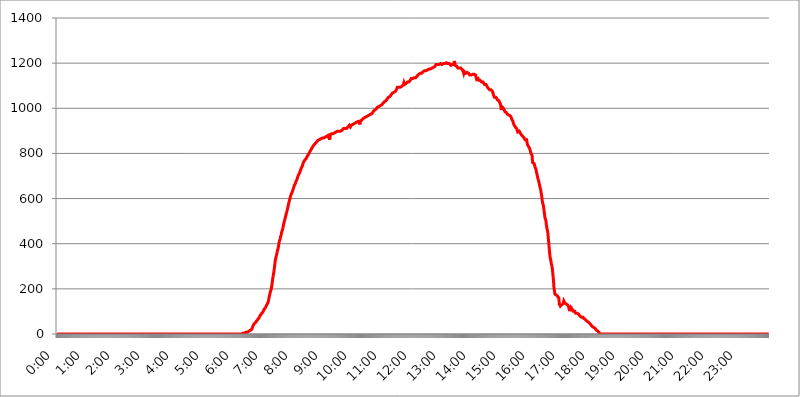
| Category | 2015.09.22. Intenzitás [W/m^2] |
|---|---|
| 0.0 | 0 |
| 0.0006944444444444445 | 0 |
| 0.001388888888888889 | 0 |
| 0.0020833333333333333 | 0 |
| 0.002777777777777778 | 0 |
| 0.003472222222222222 | 0 |
| 0.004166666666666667 | 0 |
| 0.004861111111111111 | 0 |
| 0.005555555555555556 | 0 |
| 0.0062499999999999995 | 0 |
| 0.006944444444444444 | 0 |
| 0.007638888888888889 | 0 |
| 0.008333333333333333 | 0 |
| 0.009027777777777779 | 0 |
| 0.009722222222222222 | 0 |
| 0.010416666666666666 | 0 |
| 0.011111111111111112 | 0 |
| 0.011805555555555555 | 0 |
| 0.012499999999999999 | 0 |
| 0.013194444444444444 | 0 |
| 0.013888888888888888 | 0 |
| 0.014583333333333332 | 0 |
| 0.015277777777777777 | 0 |
| 0.015972222222222224 | 0 |
| 0.016666666666666666 | 0 |
| 0.017361111111111112 | 0 |
| 0.018055555555555557 | 0 |
| 0.01875 | 0 |
| 0.019444444444444445 | 0 |
| 0.02013888888888889 | 0 |
| 0.020833333333333332 | 0 |
| 0.02152777777777778 | 0 |
| 0.022222222222222223 | 0 |
| 0.02291666666666667 | 0 |
| 0.02361111111111111 | 0 |
| 0.024305555555555556 | 0 |
| 0.024999999999999998 | 0 |
| 0.025694444444444447 | 0 |
| 0.02638888888888889 | 0 |
| 0.027083333333333334 | 0 |
| 0.027777777777777776 | 0 |
| 0.02847222222222222 | 0 |
| 0.029166666666666664 | 0 |
| 0.029861111111111113 | 0 |
| 0.030555555555555555 | 0 |
| 0.03125 | 0 |
| 0.03194444444444445 | 0 |
| 0.03263888888888889 | 0 |
| 0.03333333333333333 | 0 |
| 0.034027777777777775 | 0 |
| 0.034722222222222224 | 0 |
| 0.035416666666666666 | 0 |
| 0.036111111111111115 | 0 |
| 0.03680555555555556 | 0 |
| 0.0375 | 0 |
| 0.03819444444444444 | 0 |
| 0.03888888888888889 | 0 |
| 0.03958333333333333 | 0 |
| 0.04027777777777778 | 0 |
| 0.04097222222222222 | 0 |
| 0.041666666666666664 | 0 |
| 0.042361111111111106 | 0 |
| 0.04305555555555556 | 0 |
| 0.043750000000000004 | 0 |
| 0.044444444444444446 | 0 |
| 0.04513888888888889 | 0 |
| 0.04583333333333334 | 0 |
| 0.04652777777777778 | 0 |
| 0.04722222222222222 | 0 |
| 0.04791666666666666 | 0 |
| 0.04861111111111111 | 0 |
| 0.049305555555555554 | 0 |
| 0.049999999999999996 | 0 |
| 0.05069444444444445 | 0 |
| 0.051388888888888894 | 0 |
| 0.052083333333333336 | 0 |
| 0.05277777777777778 | 0 |
| 0.05347222222222222 | 0 |
| 0.05416666666666667 | 0 |
| 0.05486111111111111 | 0 |
| 0.05555555555555555 | 0 |
| 0.05625 | 0 |
| 0.05694444444444444 | 0 |
| 0.057638888888888885 | 0 |
| 0.05833333333333333 | 0 |
| 0.05902777777777778 | 0 |
| 0.059722222222222225 | 0 |
| 0.06041666666666667 | 0 |
| 0.061111111111111116 | 0 |
| 0.06180555555555556 | 0 |
| 0.0625 | 0 |
| 0.06319444444444444 | 0 |
| 0.06388888888888888 | 0 |
| 0.06458333333333334 | 0 |
| 0.06527777777777778 | 0 |
| 0.06597222222222222 | 0 |
| 0.06666666666666667 | 0 |
| 0.06736111111111111 | 0 |
| 0.06805555555555555 | 0 |
| 0.06874999999999999 | 0 |
| 0.06944444444444443 | 0 |
| 0.07013888888888889 | 0 |
| 0.07083333333333333 | 0 |
| 0.07152777777777779 | 0 |
| 0.07222222222222223 | 0 |
| 0.07291666666666667 | 0 |
| 0.07361111111111111 | 0 |
| 0.07430555555555556 | 0 |
| 0.075 | 0 |
| 0.07569444444444444 | 0 |
| 0.0763888888888889 | 0 |
| 0.07708333333333334 | 0 |
| 0.07777777777777778 | 0 |
| 0.07847222222222222 | 0 |
| 0.07916666666666666 | 0 |
| 0.0798611111111111 | 0 |
| 0.08055555555555556 | 0 |
| 0.08125 | 0 |
| 0.08194444444444444 | 0 |
| 0.08263888888888889 | 0 |
| 0.08333333333333333 | 0 |
| 0.08402777777777777 | 0 |
| 0.08472222222222221 | 0 |
| 0.08541666666666665 | 0 |
| 0.08611111111111112 | 0 |
| 0.08680555555555557 | 0 |
| 0.08750000000000001 | 0 |
| 0.08819444444444445 | 0 |
| 0.08888888888888889 | 0 |
| 0.08958333333333333 | 0 |
| 0.09027777777777778 | 0 |
| 0.09097222222222222 | 0 |
| 0.09166666666666667 | 0 |
| 0.09236111111111112 | 0 |
| 0.09305555555555556 | 0 |
| 0.09375 | 0 |
| 0.09444444444444444 | 0 |
| 0.09513888888888888 | 0 |
| 0.09583333333333333 | 0 |
| 0.09652777777777777 | 0 |
| 0.09722222222222222 | 0 |
| 0.09791666666666667 | 0 |
| 0.09861111111111111 | 0 |
| 0.09930555555555555 | 0 |
| 0.09999999999999999 | 0 |
| 0.10069444444444443 | 0 |
| 0.1013888888888889 | 0 |
| 0.10208333333333335 | 0 |
| 0.10277777777777779 | 0 |
| 0.10347222222222223 | 0 |
| 0.10416666666666667 | 0 |
| 0.10486111111111111 | 0 |
| 0.10555555555555556 | 0 |
| 0.10625 | 0 |
| 0.10694444444444444 | 0 |
| 0.1076388888888889 | 0 |
| 0.10833333333333334 | 0 |
| 0.10902777777777778 | 0 |
| 0.10972222222222222 | 0 |
| 0.1111111111111111 | 0 |
| 0.11180555555555556 | 0 |
| 0.11180555555555556 | 0 |
| 0.1125 | 0 |
| 0.11319444444444444 | 0 |
| 0.11388888888888889 | 0 |
| 0.11458333333333333 | 0 |
| 0.11527777777777777 | 0 |
| 0.11597222222222221 | 0 |
| 0.11666666666666665 | 0 |
| 0.1173611111111111 | 0 |
| 0.11805555555555557 | 0 |
| 0.11944444444444445 | 0 |
| 0.12013888888888889 | 0 |
| 0.12083333333333333 | 0 |
| 0.12152777777777778 | 0 |
| 0.12222222222222223 | 0 |
| 0.12291666666666667 | 0 |
| 0.12291666666666667 | 0 |
| 0.12361111111111112 | 0 |
| 0.12430555555555556 | 0 |
| 0.125 | 0 |
| 0.12569444444444444 | 0 |
| 0.12638888888888888 | 0 |
| 0.12708333333333333 | 0 |
| 0.16875 | 0 |
| 0.12847222222222224 | 0 |
| 0.12916666666666668 | 0 |
| 0.12986111111111112 | 0 |
| 0.13055555555555556 | 0 |
| 0.13125 | 0 |
| 0.13194444444444445 | 0 |
| 0.1326388888888889 | 0 |
| 0.13333333333333333 | 0 |
| 0.13402777777777777 | 0 |
| 0.13402777777777777 | 0 |
| 0.13472222222222222 | 0 |
| 0.13541666666666666 | 0 |
| 0.1361111111111111 | 0 |
| 0.13749999999999998 | 0 |
| 0.13819444444444443 | 0 |
| 0.1388888888888889 | 0 |
| 0.13958333333333334 | 0 |
| 0.14027777777777778 | 0 |
| 0.14097222222222222 | 0 |
| 0.14166666666666666 | 0 |
| 0.1423611111111111 | 0 |
| 0.14305555555555557 | 0 |
| 0.14375000000000002 | 0 |
| 0.14444444444444446 | 0 |
| 0.1451388888888889 | 0 |
| 0.1451388888888889 | 0 |
| 0.14652777777777778 | 0 |
| 0.14722222222222223 | 0 |
| 0.14791666666666667 | 0 |
| 0.1486111111111111 | 0 |
| 0.14930555555555555 | 0 |
| 0.15 | 0 |
| 0.15069444444444444 | 0 |
| 0.15138888888888888 | 0 |
| 0.15208333333333332 | 0 |
| 0.15277777777777776 | 0 |
| 0.15347222222222223 | 0 |
| 0.15416666666666667 | 0 |
| 0.15486111111111112 | 0 |
| 0.15555555555555556 | 0 |
| 0.15625 | 0 |
| 0.15694444444444444 | 0 |
| 0.15763888888888888 | 0 |
| 0.15833333333333333 | 0 |
| 0.15902777777777777 | 0 |
| 0.15972222222222224 | 0 |
| 0.16041666666666668 | 0 |
| 0.16111111111111112 | 0 |
| 0.16180555555555556 | 0 |
| 0.1625 | 0 |
| 0.16319444444444445 | 0 |
| 0.1638888888888889 | 0 |
| 0.16458333333333333 | 0 |
| 0.16527777777777777 | 0 |
| 0.16597222222222222 | 0 |
| 0.16666666666666666 | 0 |
| 0.1673611111111111 | 0 |
| 0.16805555555555554 | 0 |
| 0.16874999999999998 | 0 |
| 0.16944444444444443 | 0 |
| 0.17013888888888887 | 0 |
| 0.1708333333333333 | 0 |
| 0.17152777777777775 | 0 |
| 0.17222222222222225 | 0 |
| 0.1729166666666667 | 0 |
| 0.17361111111111113 | 0 |
| 0.17430555555555557 | 0 |
| 0.17500000000000002 | 0 |
| 0.17569444444444446 | 0 |
| 0.1763888888888889 | 0 |
| 0.17708333333333334 | 0 |
| 0.17777777777777778 | 0 |
| 0.17847222222222223 | 0 |
| 0.17916666666666667 | 0 |
| 0.1798611111111111 | 0 |
| 0.18055555555555555 | 0 |
| 0.18125 | 0 |
| 0.18194444444444444 | 0 |
| 0.1826388888888889 | 0 |
| 0.18333333333333335 | 0 |
| 0.1840277777777778 | 0 |
| 0.18472222222222223 | 0 |
| 0.18541666666666667 | 0 |
| 0.18611111111111112 | 0 |
| 0.18680555555555556 | 0 |
| 0.1875 | 0 |
| 0.18819444444444444 | 0 |
| 0.18888888888888888 | 0 |
| 0.18958333333333333 | 0 |
| 0.19027777777777777 | 0 |
| 0.1909722222222222 | 0 |
| 0.19166666666666665 | 0 |
| 0.19236111111111112 | 0 |
| 0.19305555555555554 | 0 |
| 0.19375 | 0 |
| 0.19444444444444445 | 0 |
| 0.1951388888888889 | 0 |
| 0.19583333333333333 | 0 |
| 0.19652777777777777 | 0 |
| 0.19722222222222222 | 0 |
| 0.19791666666666666 | 0 |
| 0.1986111111111111 | 0 |
| 0.19930555555555554 | 0 |
| 0.19999999999999998 | 0 |
| 0.20069444444444443 | 0 |
| 0.20138888888888887 | 0 |
| 0.2020833333333333 | 0 |
| 0.2027777777777778 | 0 |
| 0.2034722222222222 | 0 |
| 0.2041666666666667 | 0 |
| 0.20486111111111113 | 0 |
| 0.20555555555555557 | 0 |
| 0.20625000000000002 | 0 |
| 0.20694444444444446 | 0 |
| 0.2076388888888889 | 0 |
| 0.20833333333333334 | 0 |
| 0.20902777777777778 | 0 |
| 0.20972222222222223 | 0 |
| 0.21041666666666667 | 0 |
| 0.2111111111111111 | 0 |
| 0.21180555555555555 | 0 |
| 0.2125 | 0 |
| 0.21319444444444444 | 0 |
| 0.2138888888888889 | 0 |
| 0.21458333333333335 | 0 |
| 0.2152777777777778 | 0 |
| 0.21597222222222223 | 0 |
| 0.21666666666666667 | 0 |
| 0.21736111111111112 | 0 |
| 0.21805555555555556 | 0 |
| 0.21875 | 0 |
| 0.21944444444444444 | 0 |
| 0.22013888888888888 | 0 |
| 0.22083333333333333 | 0 |
| 0.22152777777777777 | 0 |
| 0.2222222222222222 | 0 |
| 0.22291666666666665 | 0 |
| 0.2236111111111111 | 0 |
| 0.22430555555555556 | 0 |
| 0.225 | 0 |
| 0.22569444444444445 | 0 |
| 0.2263888888888889 | 0 |
| 0.22708333333333333 | 0 |
| 0.22777777777777777 | 0 |
| 0.22847222222222222 | 0 |
| 0.22916666666666666 | 0 |
| 0.2298611111111111 | 0 |
| 0.23055555555555554 | 0 |
| 0.23124999999999998 | 0 |
| 0.23194444444444443 | 0 |
| 0.23263888888888887 | 0 |
| 0.2333333333333333 | 0 |
| 0.2340277777777778 | 0 |
| 0.2347222222222222 | 0 |
| 0.2354166666666667 | 0 |
| 0.23611111111111113 | 0 |
| 0.23680555555555557 | 0 |
| 0.23750000000000002 | 0 |
| 0.23819444444444446 | 0 |
| 0.2388888888888889 | 0 |
| 0.23958333333333334 | 0 |
| 0.24027777777777778 | 0 |
| 0.24097222222222223 | 0 |
| 0.24166666666666667 | 0 |
| 0.2423611111111111 | 0 |
| 0.24305555555555555 | 0 |
| 0.24375 | 0 |
| 0.24444444444444446 | 0 |
| 0.24513888888888888 | 0 |
| 0.24583333333333335 | 0 |
| 0.2465277777777778 | 0 |
| 0.24722222222222223 | 0 |
| 0.24791666666666667 | 0 |
| 0.24861111111111112 | 0 |
| 0.24930555555555556 | 0 |
| 0.25 | 0 |
| 0.25069444444444444 | 0 |
| 0.2513888888888889 | 0 |
| 0.2520833333333333 | 0 |
| 0.25277777777777777 | 0 |
| 0.2534722222222222 | 0 |
| 0.25416666666666665 | 0 |
| 0.2548611111111111 | 0 |
| 0.2555555555555556 | 0 |
| 0.25625000000000003 | 0 |
| 0.2569444444444445 | 0 |
| 0.2576388888888889 | 0 |
| 0.25833333333333336 | 0 |
| 0.2590277777777778 | 3.525 |
| 0.25972222222222224 | 3.525 |
| 0.2604166666666667 | 3.525 |
| 0.2611111111111111 | 3.525 |
| 0.26180555555555557 | 3.525 |
| 0.2625 | 3.525 |
| 0.26319444444444445 | 3.525 |
| 0.2638888888888889 | 3.525 |
| 0.26458333333333334 | 7.887 |
| 0.2652777777777778 | 7.887 |
| 0.2659722222222222 | 7.887 |
| 0.26666666666666666 | 7.887 |
| 0.2673611111111111 | 12.257 |
| 0.26805555555555555 | 12.257 |
| 0.26875 | 12.257 |
| 0.26944444444444443 | 12.257 |
| 0.2701388888888889 | 12.257 |
| 0.2708333333333333 | 16.636 |
| 0.27152777777777776 | 16.636 |
| 0.2722222222222222 | 16.636 |
| 0.27291666666666664 | 21.024 |
| 0.2736111111111111 | 25.419 |
| 0.2743055555555555 | 34.234 |
| 0.27499999999999997 | 38.653 |
| 0.27569444444444446 | 43.079 |
| 0.27638888888888885 | 43.079 |
| 0.27708333333333335 | 47.511 |
| 0.2777777777777778 | 47.511 |
| 0.27847222222222223 | 51.951 |
| 0.2791666666666667 | 56.398 |
| 0.2798611111111111 | 56.398 |
| 0.28055555555555556 | 60.85 |
| 0.28125 | 65.31 |
| 0.28194444444444444 | 65.31 |
| 0.2826388888888889 | 69.775 |
| 0.2833333333333333 | 74.246 |
| 0.28402777777777777 | 78.722 |
| 0.2847222222222222 | 83.205 |
| 0.28541666666666665 | 83.205 |
| 0.28611111111111115 | 87.692 |
| 0.28680555555555554 | 92.184 |
| 0.28750000000000003 | 92.184 |
| 0.2881944444444445 | 96.682 |
| 0.2888888888888889 | 101.184 |
| 0.28958333333333336 | 105.69 |
| 0.2902777777777778 | 110.201 |
| 0.29097222222222224 | 110.201 |
| 0.2916666666666667 | 114.716 |
| 0.2923611111111111 | 119.235 |
| 0.29305555555555557 | 123.758 |
| 0.29375 | 128.284 |
| 0.29444444444444445 | 132.814 |
| 0.2951388888888889 | 137.347 |
| 0.29583333333333334 | 141.884 |
| 0.2965277777777778 | 150.964 |
| 0.2972222222222222 | 164.605 |
| 0.29791666666666666 | 173.709 |
| 0.2986111111111111 | 182.82 |
| 0.29930555555555555 | 191.937 |
| 0.3 | 196.497 |
| 0.30069444444444443 | 210.182 |
| 0.3013888888888889 | 223.873 |
| 0.3020833333333333 | 242.127 |
| 0.30277777777777776 | 255.813 |
| 0.3034722222222222 | 269.49 |
| 0.30416666666666664 | 283.156 |
| 0.3048611111111111 | 301.354 |
| 0.3055555555555555 | 319.517 |
| 0.30624999999999997 | 333.113 |
| 0.3069444444444444 | 342.162 |
| 0.3076388888888889 | 351.198 |
| 0.30833333333333335 | 360.221 |
| 0.3090277777777778 | 373.729 |
| 0.30972222222222223 | 378.224 |
| 0.3104166666666667 | 391.685 |
| 0.3111111111111111 | 405.108 |
| 0.31180555555555556 | 414.035 |
| 0.3125 | 418.492 |
| 0.31319444444444444 | 431.833 |
| 0.3138888888888889 | 436.27 |
| 0.3145833333333333 | 449.551 |
| 0.31527777777777777 | 453.968 |
| 0.3159722222222222 | 462.786 |
| 0.31666666666666665 | 471.582 |
| 0.31736111111111115 | 484.735 |
| 0.31805555555555554 | 493.475 |
| 0.31875000000000003 | 502.192 |
| 0.3194444444444445 | 510.885 |
| 0.3201388888888889 | 519.555 |
| 0.32083333333333336 | 528.2 |
| 0.3215277777777778 | 536.82 |
| 0.32222222222222224 | 545.416 |
| 0.3229166666666667 | 553.986 |
| 0.3236111111111111 | 562.53 |
| 0.32430555555555557 | 575.299 |
| 0.325 | 583.779 |
| 0.32569444444444445 | 592.233 |
| 0.3263888888888889 | 600.661 |
| 0.32708333333333334 | 609.062 |
| 0.3277777777777778 | 617.436 |
| 0.3284722222222222 | 621.613 |
| 0.32916666666666666 | 625.784 |
| 0.3298611111111111 | 629.948 |
| 0.33055555555555555 | 638.256 |
| 0.33125 | 646.537 |
| 0.33194444444444443 | 650.667 |
| 0.3326388888888889 | 658.909 |
| 0.3333333333333333 | 663.019 |
| 0.3340277777777778 | 667.123 |
| 0.3347222222222222 | 675.311 |
| 0.3354166666666667 | 679.395 |
| 0.3361111111111111 | 683.473 |
| 0.3368055555555556 | 691.608 |
| 0.33749999999999997 | 695.666 |
| 0.33819444444444446 | 703.762 |
| 0.33888888888888885 | 707.8 |
| 0.33958333333333335 | 711.832 |
| 0.34027777777777773 | 715.858 |
| 0.34097222222222223 | 723.889 |
| 0.3416666666666666 | 727.896 |
| 0.3423611111111111 | 735.89 |
| 0.3430555555555555 | 739.877 |
| 0.34375 | 743.859 |
| 0.3444444444444445 | 751.803 |
| 0.3451388888888889 | 759.723 |
| 0.3458333333333334 | 759.723 |
| 0.34652777777777777 | 767.62 |
| 0.34722222222222227 | 771.559 |
| 0.34791666666666665 | 771.559 |
| 0.34861111111111115 | 775.492 |
| 0.34930555555555554 | 779.42 |
| 0.35000000000000003 | 783.342 |
| 0.3506944444444444 | 787.258 |
| 0.3513888888888889 | 791.169 |
| 0.3520833333333333 | 795.074 |
| 0.3527777777777778 | 798.974 |
| 0.3534722222222222 | 802.868 |
| 0.3541666666666667 | 806.757 |
| 0.3548611111111111 | 806.757 |
| 0.35555555555555557 | 802.868 |
| 0.35625 | 818.392 |
| 0.35694444444444445 | 822.26 |
| 0.3576388888888889 | 826.123 |
| 0.35833333333333334 | 829.981 |
| 0.3590277777777778 | 833.834 |
| 0.3597222222222222 | 833.834 |
| 0.36041666666666666 | 837.682 |
| 0.3611111111111111 | 841.526 |
| 0.36180555555555555 | 845.365 |
| 0.3625 | 845.365 |
| 0.36319444444444443 | 849.199 |
| 0.3638888888888889 | 849.199 |
| 0.3645833333333333 | 853.029 |
| 0.3652777777777778 | 856.855 |
| 0.3659722222222222 | 856.855 |
| 0.3666666666666667 | 853.029 |
| 0.3673611111111111 | 860.676 |
| 0.3680555555555556 | 864.493 |
| 0.36874999999999997 | 864.493 |
| 0.36944444444444446 | 864.493 |
| 0.37013888888888885 | 868.305 |
| 0.37083333333333335 | 868.305 |
| 0.37152777777777773 | 868.305 |
| 0.37222222222222223 | 868.305 |
| 0.3729166666666666 | 868.305 |
| 0.3736111111111111 | 868.305 |
| 0.3743055555555555 | 868.305 |
| 0.375 | 868.305 |
| 0.3756944444444445 | 872.114 |
| 0.3763888888888889 | 875.918 |
| 0.3770833333333334 | 872.114 |
| 0.37777777777777777 | 875.918 |
| 0.37847222222222227 | 875.918 |
| 0.37916666666666665 | 875.918 |
| 0.37986111111111115 | 879.719 |
| 0.38055555555555554 | 883.516 |
| 0.38125000000000003 | 883.516 |
| 0.3819444444444444 | 860.676 |
| 0.3826388888888889 | 883.516 |
| 0.3833333333333333 | 887.309 |
| 0.3840277777777778 | 887.309 |
| 0.3847222222222222 | 887.309 |
| 0.3854166666666667 | 887.309 |
| 0.3861111111111111 | 887.309 |
| 0.38680555555555557 | 887.309 |
| 0.3875 | 891.099 |
| 0.38819444444444445 | 891.099 |
| 0.3888888888888889 | 891.099 |
| 0.38958333333333334 | 894.885 |
| 0.3902777777777778 | 894.885 |
| 0.3909722222222222 | 894.885 |
| 0.39166666666666666 | 898.668 |
| 0.3923611111111111 | 898.668 |
| 0.39305555555555555 | 898.668 |
| 0.39375 | 898.668 |
| 0.39444444444444443 | 902.447 |
| 0.3951388888888889 | 898.668 |
| 0.3958333333333333 | 898.668 |
| 0.3965277777777778 | 898.668 |
| 0.3972222222222222 | 898.668 |
| 0.3979166666666667 | 902.447 |
| 0.3986111111111111 | 898.668 |
| 0.3993055555555556 | 902.447 |
| 0.39999999999999997 | 902.447 |
| 0.40069444444444446 | 906.223 |
| 0.40138888888888885 | 909.996 |
| 0.40208333333333335 | 909.996 |
| 0.40277777777777773 | 909.996 |
| 0.40347222222222223 | 909.996 |
| 0.4041666666666666 | 913.766 |
| 0.4048611111111111 | 913.766 |
| 0.4055555555555555 | 909.996 |
| 0.40625 | 913.766 |
| 0.4069444444444445 | 913.766 |
| 0.4076388888888889 | 917.534 |
| 0.4083333333333334 | 921.298 |
| 0.40902777777777777 | 921.298 |
| 0.40972222222222227 | 925.06 |
| 0.41041666666666665 | 925.06 |
| 0.41111111111111115 | 917.534 |
| 0.41180555555555554 | 917.534 |
| 0.41250000000000003 | 925.06 |
| 0.4131944444444444 | 925.06 |
| 0.4138888888888889 | 928.819 |
| 0.4145833333333333 | 928.819 |
| 0.4152777777777778 | 928.819 |
| 0.4159722222222222 | 932.576 |
| 0.4166666666666667 | 932.576 |
| 0.4173611111111111 | 932.576 |
| 0.41805555555555557 | 932.576 |
| 0.41875 | 936.33 |
| 0.41944444444444445 | 936.33 |
| 0.4201388888888889 | 936.33 |
| 0.42083333333333334 | 940.082 |
| 0.4215277777777778 | 940.082 |
| 0.4222222222222222 | 940.082 |
| 0.42291666666666666 | 940.082 |
| 0.4236111111111111 | 947.58 |
| 0.42430555555555555 | 928.819 |
| 0.425 | 943.832 |
| 0.42569444444444443 | 947.58 |
| 0.4263888888888889 | 947.58 |
| 0.4270833333333333 | 947.58 |
| 0.4277777777777778 | 951.327 |
| 0.4284722222222222 | 951.327 |
| 0.4291666666666667 | 955.071 |
| 0.4298611111111111 | 955.071 |
| 0.4305555555555556 | 958.814 |
| 0.43124999999999997 | 958.814 |
| 0.43194444444444446 | 955.071 |
| 0.43263888888888885 | 958.814 |
| 0.43333333333333335 | 962.555 |
| 0.43402777777777773 | 962.555 |
| 0.43472222222222223 | 962.555 |
| 0.4354166666666666 | 966.295 |
| 0.4361111111111111 | 966.295 |
| 0.4368055555555555 | 970.034 |
| 0.4375 | 970.034 |
| 0.4381944444444445 | 973.772 |
| 0.4388888888888889 | 973.772 |
| 0.4395833333333334 | 973.772 |
| 0.44027777777777777 | 977.508 |
| 0.44097222222222227 | 977.508 |
| 0.44166666666666665 | 977.508 |
| 0.44236111111111115 | 981.244 |
| 0.44305555555555554 | 984.98 |
| 0.44375000000000003 | 988.714 |
| 0.4444444444444444 | 988.714 |
| 0.4451388888888889 | 992.448 |
| 0.4458333333333333 | 992.448 |
| 0.4465277777777778 | 996.182 |
| 0.4472222222222222 | 996.182 |
| 0.4479166666666667 | 999.916 |
| 0.4486111111111111 | 1003.65 |
| 0.44930555555555557 | 999.916 |
| 0.45 | 1007.383 |
| 0.45069444444444445 | 1007.383 |
| 0.4513888888888889 | 1007.383 |
| 0.45208333333333334 | 1011.118 |
| 0.4527777777777778 | 1011.118 |
| 0.4534722222222222 | 1007.383 |
| 0.45416666666666666 | 1011.118 |
| 0.4548611111111111 | 1014.852 |
| 0.45555555555555555 | 1014.852 |
| 0.45625 | 1018.587 |
| 0.45694444444444443 | 1022.323 |
| 0.4576388888888889 | 1026.06 |
| 0.4583333333333333 | 1026.06 |
| 0.4590277777777778 | 1029.798 |
| 0.4597222222222222 | 1029.798 |
| 0.4604166666666667 | 1033.537 |
| 0.4611111111111111 | 1033.537 |
| 0.4618055555555556 | 1037.277 |
| 0.46249999999999997 | 1041.019 |
| 0.46319444444444446 | 1041.019 |
| 0.46388888888888885 | 1044.762 |
| 0.46458333333333335 | 1048.508 |
| 0.46527777777777773 | 1048.508 |
| 0.46597222222222223 | 1052.255 |
| 0.4666666666666666 | 1052.255 |
| 0.4673611111111111 | 1056.004 |
| 0.4680555555555555 | 1059.756 |
| 0.46875 | 1059.756 |
| 0.4694444444444445 | 1063.51 |
| 0.4701388888888889 | 1067.267 |
| 0.4708333333333334 | 1067.267 |
| 0.47152777777777777 | 1067.267 |
| 0.47222222222222227 | 1071.027 |
| 0.47291666666666665 | 1071.027 |
| 0.47361111111111115 | 1074.789 |
| 0.47430555555555554 | 1074.789 |
| 0.47500000000000003 | 1074.789 |
| 0.4756944444444444 | 1082.324 |
| 0.4763888888888889 | 1086.097 |
| 0.4770833333333333 | 1093.653 |
| 0.4777777777777778 | 1093.653 |
| 0.4784722222222222 | 1093.653 |
| 0.4791666666666667 | 1093.653 |
| 0.4798611111111111 | 1093.653 |
| 0.48055555555555557 | 1093.653 |
| 0.48125 | 1093.653 |
| 0.48194444444444445 | 1093.653 |
| 0.4826388888888889 | 1093.653 |
| 0.48333333333333334 | 1097.437 |
| 0.4840277777777778 | 1097.437 |
| 0.4847222222222222 | 1101.226 |
| 0.48541666666666666 | 1105.019 |
| 0.4861111111111111 | 1112.618 |
| 0.48680555555555555 | 1105.019 |
| 0.4875 | 1108.816 |
| 0.48819444444444443 | 1105.019 |
| 0.4888888888888889 | 1108.816 |
| 0.4895833333333333 | 1108.816 |
| 0.4902777777777778 | 1112.618 |
| 0.4909722222222222 | 1116.426 |
| 0.4916666666666667 | 1116.426 |
| 0.4923611111111111 | 1116.426 |
| 0.4930555555555556 | 1116.426 |
| 0.49374999999999997 | 1120.238 |
| 0.49444444444444446 | 1120.238 |
| 0.49513888888888885 | 1124.056 |
| 0.49583333333333335 | 1127.879 |
| 0.49652777777777773 | 1131.708 |
| 0.49722222222222223 | 1131.708 |
| 0.4979166666666666 | 1131.708 |
| 0.4986111111111111 | 1131.708 |
| 0.4993055555555555 | 1135.543 |
| 0.5 | 1135.543 |
| 0.5006944444444444 | 1135.543 |
| 0.5013888888888889 | 1139.384 |
| 0.5020833333333333 | 1139.384 |
| 0.5027777777777778 | 1135.543 |
| 0.5034722222222222 | 1139.384 |
| 0.5041666666666667 | 1139.384 |
| 0.5048611111111111 | 1143.232 |
| 0.5055555555555555 | 1147.086 |
| 0.50625 | 1147.086 |
| 0.5069444444444444 | 1150.946 |
| 0.5076388888888889 | 1150.946 |
| 0.5083333333333333 | 1154.814 |
| 0.5090277777777777 | 1154.814 |
| 0.5097222222222222 | 1154.814 |
| 0.5104166666666666 | 1154.814 |
| 0.5111111111111112 | 1154.814 |
| 0.5118055555555555 | 1158.689 |
| 0.5125000000000001 | 1158.689 |
| 0.5131944444444444 | 1162.571 |
| 0.513888888888889 | 1162.571 |
| 0.5145833333333333 | 1162.571 |
| 0.5152777777777778 | 1166.46 |
| 0.5159722222222222 | 1162.571 |
| 0.5166666666666667 | 1162.571 |
| 0.517361111111111 | 1166.46 |
| 0.5180555555555556 | 1166.46 |
| 0.5187499999999999 | 1162.571 |
| 0.5194444444444445 | 1170.358 |
| 0.5201388888888888 | 1170.358 |
| 0.5208333333333334 | 1174.263 |
| 0.5215277777777778 | 1174.263 |
| 0.5222222222222223 | 1170.358 |
| 0.5229166666666667 | 1170.358 |
| 0.5236111111111111 | 1174.263 |
| 0.5243055555555556 | 1178.177 |
| 0.525 | 1178.177 |
| 0.5256944444444445 | 1178.177 |
| 0.5263888888888889 | 1174.263 |
| 0.5270833333333333 | 1178.177 |
| 0.5277777777777778 | 1182.099 |
| 0.5284722222222222 | 1182.099 |
| 0.5291666666666667 | 1186.03 |
| 0.5298611111111111 | 1186.03 |
| 0.5305555555555556 | 1189.969 |
| 0.53125 | 1193.918 |
| 0.5319444444444444 | 1193.918 |
| 0.5326388888888889 | 1189.969 |
| 0.5333333333333333 | 1193.918 |
| 0.5340277777777778 | 1193.918 |
| 0.5347222222222222 | 1193.918 |
| 0.5354166666666667 | 1193.918 |
| 0.5361111111111111 | 1193.918 |
| 0.5368055555555555 | 1193.918 |
| 0.5375 | 1197.876 |
| 0.5381944444444444 | 1193.918 |
| 0.5388888888888889 | 1197.876 |
| 0.5395833333333333 | 1193.918 |
| 0.5402777777777777 | 1193.918 |
| 0.5409722222222222 | 1197.876 |
| 0.5416666666666666 | 1197.876 |
| 0.5423611111111112 | 1197.876 |
| 0.5430555555555555 | 1193.918 |
| 0.5437500000000001 | 1197.876 |
| 0.5444444444444444 | 1197.876 |
| 0.545138888888889 | 1197.876 |
| 0.5458333333333333 | 1201.843 |
| 0.5465277777777778 | 1197.876 |
| 0.5472222222222222 | 1197.876 |
| 0.5479166666666667 | 1197.876 |
| 0.548611111111111 | 1197.876 |
| 0.5493055555555556 | 1197.876 |
| 0.5499999999999999 | 1197.876 |
| 0.5506944444444445 | 1197.876 |
| 0.5513888888888888 | 1193.918 |
| 0.5520833333333334 | 1189.969 |
| 0.5527777777777778 | 1193.918 |
| 0.5534722222222223 | 1193.918 |
| 0.5541666666666667 | 1193.918 |
| 0.5548611111111111 | 1193.918 |
| 0.5555555555555556 | 1189.969 |
| 0.55625 | 1193.918 |
| 0.5569444444444445 | 1209.807 |
| 0.5576388888888889 | 1197.876 |
| 0.5583333333333333 | 1189.969 |
| 0.5590277777777778 | 1189.969 |
| 0.5597222222222222 | 1186.03 |
| 0.5604166666666667 | 1186.03 |
| 0.5611111111111111 | 1186.03 |
| 0.5618055555555556 | 1178.177 |
| 0.5625 | 1182.099 |
| 0.5631944444444444 | 1178.177 |
| 0.5638888888888889 | 1178.177 |
| 0.5645833333333333 | 1174.263 |
| 0.5652777777777778 | 1178.177 |
| 0.5659722222222222 | 1178.177 |
| 0.5666666666666667 | 1174.263 |
| 0.5673611111111111 | 1174.263 |
| 0.5680555555555555 | 1170.358 |
| 0.56875 | 1170.358 |
| 0.5694444444444444 | 1162.571 |
| 0.5701388888888889 | 1154.814 |
| 0.5708333333333333 | 1162.571 |
| 0.5715277777777777 | 1162.571 |
| 0.5722222222222222 | 1162.571 |
| 0.5729166666666666 | 1154.814 |
| 0.5736111111111112 | 1154.814 |
| 0.5743055555555555 | 1158.689 |
| 0.5750000000000001 | 1158.689 |
| 0.5756944444444444 | 1162.571 |
| 0.576388888888889 | 1158.689 |
| 0.5770833333333333 | 1154.814 |
| 0.5777777777777778 | 1150.946 |
| 0.5784722222222222 | 1147.086 |
| 0.5791666666666667 | 1147.086 |
| 0.579861111111111 | 1147.086 |
| 0.5805555555555556 | 1147.086 |
| 0.5812499999999999 | 1150.946 |
| 0.5819444444444445 | 1150.946 |
| 0.5826388888888888 | 1150.946 |
| 0.5833333333333334 | 1150.946 |
| 0.5840277777777778 | 1150.946 |
| 0.5847222222222223 | 1150.946 |
| 0.5854166666666667 | 1150.946 |
| 0.5861111111111111 | 1150.946 |
| 0.5868055555555556 | 1147.086 |
| 0.5875 | 1135.543 |
| 0.5881944444444445 | 1127.879 |
| 0.5888888888888889 | 1131.708 |
| 0.5895833333333333 | 1131.708 |
| 0.5902777777777778 | 1131.708 |
| 0.5909722222222222 | 1124.056 |
| 0.5916666666666667 | 1127.879 |
| 0.5923611111111111 | 1127.879 |
| 0.5930555555555556 | 1124.056 |
| 0.59375 | 1120.238 |
| 0.5944444444444444 | 1120.238 |
| 0.5951388888888889 | 1116.426 |
| 0.5958333333333333 | 1116.426 |
| 0.5965277777777778 | 1116.426 |
| 0.5972222222222222 | 1116.426 |
| 0.5979166666666667 | 1116.426 |
| 0.5986111111111111 | 1112.618 |
| 0.5993055555555555 | 1105.019 |
| 0.6 | 1105.019 |
| 0.6006944444444444 | 1105.019 |
| 0.6013888888888889 | 1105.019 |
| 0.6020833333333333 | 1101.226 |
| 0.6027777777777777 | 1097.437 |
| 0.6034722222222222 | 1093.653 |
| 0.6041666666666666 | 1089.873 |
| 0.6048611111111112 | 1093.653 |
| 0.6055555555555555 | 1086.097 |
| 0.6062500000000001 | 1082.324 |
| 0.6069444444444444 | 1082.324 |
| 0.607638888888889 | 1082.324 |
| 0.6083333333333333 | 1082.324 |
| 0.6090277777777778 | 1078.555 |
| 0.6097222222222222 | 1078.555 |
| 0.6104166666666667 | 1074.789 |
| 0.611111111111111 | 1074.789 |
| 0.6118055555555556 | 1059.756 |
| 0.6124999999999999 | 1056.004 |
| 0.6131944444444445 | 1048.508 |
| 0.6138888888888888 | 1048.508 |
| 0.6145833333333334 | 1044.762 |
| 0.6152777777777778 | 1048.508 |
| 0.6159722222222223 | 1044.762 |
| 0.6166666666666667 | 1044.762 |
| 0.6173611111111111 | 1037.277 |
| 0.6180555555555556 | 1041.019 |
| 0.61875 | 1041.019 |
| 0.6194444444444445 | 1033.537 |
| 0.6201388888888889 | 1029.798 |
| 0.6208333333333333 | 1029.798 |
| 0.6215277777777778 | 1018.587 |
| 0.6222222222222222 | 1007.383 |
| 0.6229166666666667 | 992.448 |
| 0.6236111111111111 | 1007.383 |
| 0.6243055555555556 | 1007.383 |
| 0.625 | 1003.65 |
| 0.6256944444444444 | 999.916 |
| 0.6263888888888889 | 996.182 |
| 0.6270833333333333 | 992.448 |
| 0.6277777777777778 | 984.98 |
| 0.6284722222222222 | 984.98 |
| 0.6291666666666667 | 981.244 |
| 0.6298611111111111 | 981.244 |
| 0.6305555555555555 | 977.508 |
| 0.63125 | 973.772 |
| 0.6319444444444444 | 973.772 |
| 0.6326388888888889 | 970.034 |
| 0.6333333333333333 | 970.034 |
| 0.6340277777777777 | 970.034 |
| 0.6347222222222222 | 970.034 |
| 0.6354166666666666 | 966.295 |
| 0.6361111111111112 | 966.295 |
| 0.6368055555555555 | 958.814 |
| 0.6375000000000001 | 951.327 |
| 0.6381944444444444 | 947.58 |
| 0.638888888888889 | 943.832 |
| 0.6395833333333333 | 936.33 |
| 0.6402777777777778 | 928.819 |
| 0.6409722222222222 | 928.819 |
| 0.6416666666666667 | 925.06 |
| 0.642361111111111 | 917.534 |
| 0.6430555555555556 | 913.766 |
| 0.6437499999999999 | 913.766 |
| 0.6444444444444445 | 909.996 |
| 0.6451388888888888 | 906.223 |
| 0.6458333333333334 | 894.885 |
| 0.6465277777777778 | 894.885 |
| 0.6472222222222223 | 891.099 |
| 0.6479166666666667 | 898.668 |
| 0.6486111111111111 | 894.885 |
| 0.6493055555555556 | 891.099 |
| 0.65 | 887.309 |
| 0.6506944444444445 | 883.516 |
| 0.6513888888888889 | 887.309 |
| 0.6520833333333333 | 883.516 |
| 0.6527777777777778 | 875.918 |
| 0.6534722222222222 | 875.918 |
| 0.6541666666666667 | 872.114 |
| 0.6548611111111111 | 868.305 |
| 0.6555555555555556 | 864.493 |
| 0.65625 | 860.676 |
| 0.6569444444444444 | 860.676 |
| 0.6576388888888889 | 856.855 |
| 0.6583333333333333 | 860.676 |
| 0.6590277777777778 | 845.365 |
| 0.6597222222222222 | 837.682 |
| 0.6604166666666667 | 837.682 |
| 0.6611111111111111 | 829.981 |
| 0.6618055555555555 | 826.123 |
| 0.6625 | 822.26 |
| 0.6631944444444444 | 814.519 |
| 0.6638888888888889 | 810.641 |
| 0.6645833333333333 | 798.974 |
| 0.6652777777777777 | 795.074 |
| 0.6659722222222222 | 791.169 |
| 0.6666666666666666 | 759.723 |
| 0.6673611111111111 | 759.723 |
| 0.6680555555555556 | 759.723 |
| 0.6687500000000001 | 755.766 |
| 0.6694444444444444 | 747.834 |
| 0.6701388888888888 | 739.877 |
| 0.6708333333333334 | 735.89 |
| 0.6715277777777778 | 727.896 |
| 0.6722222222222222 | 715.858 |
| 0.6729166666666666 | 707.8 |
| 0.6736111111111112 | 695.666 |
| 0.6743055555555556 | 687.544 |
| 0.6749999999999999 | 683.473 |
| 0.6756944444444444 | 671.22 |
| 0.6763888888888889 | 667.123 |
| 0.6770833333333334 | 650.667 |
| 0.6777777777777777 | 642.4 |
| 0.6784722222222223 | 629.948 |
| 0.6791666666666667 | 617.436 |
| 0.6798611111111111 | 600.661 |
| 0.6805555555555555 | 583.779 |
| 0.68125 | 575.299 |
| 0.6819444444444445 | 566.793 |
| 0.6826388888888889 | 549.704 |
| 0.6833333333333332 | 532.513 |
| 0.6840277777777778 | 515.223 |
| 0.6847222222222222 | 510.885 |
| 0.6854166666666667 | 502.192 |
| 0.686111111111111 | 480.356 |
| 0.6868055555555556 | 467.187 |
| 0.6875 | 458.38 |
| 0.6881944444444444 | 445.129 |
| 0.688888888888889 | 418.492 |
| 0.6895833333333333 | 396.164 |
| 0.6902777777777778 | 369.23 |
| 0.6909722222222222 | 346.682 |
| 0.6916666666666668 | 333.113 |
| 0.6923611111111111 | 324.052 |
| 0.6930555555555555 | 310.44 |
| 0.69375 | 301.354 |
| 0.6944444444444445 | 287.709 |
| 0.6951388888888889 | 264.932 |
| 0.6958333333333333 | 242.127 |
| 0.6965277777777777 | 210.182 |
| 0.6972222222222223 | 191.937 |
| 0.6979166666666666 | 178.264 |
| 0.6986111111111111 | 178.264 |
| 0.6993055555555556 | 173.709 |
| 0.7000000000000001 | 173.709 |
| 0.7006944444444444 | 173.709 |
| 0.7013888888888888 | 169.156 |
| 0.7020833333333334 | 164.605 |
| 0.7027777777777778 | 164.605 |
| 0.7034722222222222 | 160.056 |
| 0.7041666666666666 | 132.814 |
| 0.7048611111111112 | 132.814 |
| 0.7055555555555556 | 123.758 |
| 0.7062499999999999 | 123.758 |
| 0.7069444444444444 | 128.284 |
| 0.7076388888888889 | 128.284 |
| 0.7083333333333334 | 128.284 |
| 0.7090277777777777 | 132.814 |
| 0.7097222222222223 | 137.347 |
| 0.7104166666666667 | 146.423 |
| 0.7111111111111111 | 141.884 |
| 0.7118055555555555 | 137.347 |
| 0.7125 | 137.347 |
| 0.7131944444444445 | 137.347 |
| 0.7138888888888889 | 132.814 |
| 0.7145833333333332 | 132.814 |
| 0.7152777777777778 | 132.814 |
| 0.7159722222222222 | 128.284 |
| 0.7166666666666667 | 128.284 |
| 0.717361111111111 | 119.235 |
| 0.7180555555555556 | 119.235 |
| 0.71875 | 101.184 |
| 0.7194444444444444 | 114.716 |
| 0.720138888888889 | 119.235 |
| 0.7208333333333333 | 119.235 |
| 0.7215277777777778 | 119.235 |
| 0.7222222222222222 | 110.201 |
| 0.7229166666666668 | 105.69 |
| 0.7236111111111111 | 101.184 |
| 0.7243055555555555 | 101.184 |
| 0.725 | 101.184 |
| 0.7256944444444445 | 101.184 |
| 0.7263888888888889 | 101.184 |
| 0.7270833333333333 | 92.184 |
| 0.7277777777777777 | 92.184 |
| 0.7284722222222223 | 92.184 |
| 0.7291666666666666 | 92.184 |
| 0.7298611111111111 | 92.184 |
| 0.7305555555555556 | 92.184 |
| 0.7312500000000001 | 87.692 |
| 0.7319444444444444 | 83.205 |
| 0.7326388888888888 | 83.205 |
| 0.7333333333333334 | 78.722 |
| 0.7340277777777778 | 78.722 |
| 0.7347222222222222 | 78.722 |
| 0.7354166666666666 | 74.246 |
| 0.7361111111111112 | 74.246 |
| 0.7368055555555556 | 74.246 |
| 0.7374999999999999 | 74.246 |
| 0.7381944444444444 | 69.775 |
| 0.7388888888888889 | 69.775 |
| 0.7395833333333334 | 69.775 |
| 0.7402777777777777 | 65.31 |
| 0.7409722222222223 | 65.31 |
| 0.7416666666666667 | 60.85 |
| 0.7423611111111111 | 60.85 |
| 0.7430555555555555 | 56.398 |
| 0.74375 | 56.398 |
| 0.7444444444444445 | 56.398 |
| 0.7451388888888889 | 51.951 |
| 0.7458333333333332 | 51.951 |
| 0.7465277777777778 | 47.511 |
| 0.7472222222222222 | 47.511 |
| 0.7479166666666667 | 43.079 |
| 0.748611111111111 | 43.079 |
| 0.7493055555555556 | 38.653 |
| 0.75 | 34.234 |
| 0.7506944444444444 | 29.823 |
| 0.751388888888889 | 29.823 |
| 0.7520833333333333 | 29.823 |
| 0.7527777777777778 | 25.419 |
| 0.7534722222222222 | 25.419 |
| 0.7541666666666668 | 25.419 |
| 0.7548611111111111 | 21.024 |
| 0.7555555555555555 | 21.024 |
| 0.75625 | 16.636 |
| 0.7569444444444445 | 16.636 |
| 0.7576388888888889 | 12.257 |
| 0.7583333333333333 | 12.257 |
| 0.7590277777777777 | 7.887 |
| 0.7597222222222223 | 7.887 |
| 0.7604166666666666 | 3.525 |
| 0.7611111111111111 | 3.525 |
| 0.7618055555555556 | 3.525 |
| 0.7625000000000001 | 0 |
| 0.7631944444444444 | 0 |
| 0.7638888888888888 | 0 |
| 0.7645833333333334 | 0 |
| 0.7652777777777778 | 0 |
| 0.7659722222222222 | 0 |
| 0.7666666666666666 | 0 |
| 0.7673611111111112 | 0 |
| 0.7680555555555556 | 0 |
| 0.7687499999999999 | 0 |
| 0.7694444444444444 | 0 |
| 0.7701388888888889 | 0 |
| 0.7708333333333334 | 0 |
| 0.7715277777777777 | 0 |
| 0.7722222222222223 | 0 |
| 0.7729166666666667 | 0 |
| 0.7736111111111111 | 0 |
| 0.7743055555555555 | 0 |
| 0.775 | 0 |
| 0.7756944444444445 | 0 |
| 0.7763888888888889 | 0 |
| 0.7770833333333332 | 0 |
| 0.7777777777777778 | 0 |
| 0.7784722222222222 | 0 |
| 0.7791666666666667 | 0 |
| 0.779861111111111 | 0 |
| 0.7805555555555556 | 0 |
| 0.78125 | 0 |
| 0.7819444444444444 | 0 |
| 0.782638888888889 | 0 |
| 0.7833333333333333 | 0 |
| 0.7840277777777778 | 0 |
| 0.7847222222222222 | 0 |
| 0.7854166666666668 | 0 |
| 0.7861111111111111 | 0 |
| 0.7868055555555555 | 0 |
| 0.7875 | 0 |
| 0.7881944444444445 | 0 |
| 0.7888888888888889 | 0 |
| 0.7895833333333333 | 0 |
| 0.7902777777777777 | 0 |
| 0.7909722222222223 | 0 |
| 0.7916666666666666 | 0 |
| 0.7923611111111111 | 0 |
| 0.7930555555555556 | 0 |
| 0.7937500000000001 | 0 |
| 0.7944444444444444 | 0 |
| 0.7951388888888888 | 0 |
| 0.7958333333333334 | 0 |
| 0.7965277777777778 | 0 |
| 0.7972222222222222 | 0 |
| 0.7979166666666666 | 0 |
| 0.7986111111111112 | 0 |
| 0.7993055555555556 | 0 |
| 0.7999999999999999 | 0 |
| 0.8006944444444444 | 0 |
| 0.8013888888888889 | 0 |
| 0.8020833333333334 | 0 |
| 0.8027777777777777 | 0 |
| 0.8034722222222223 | 0 |
| 0.8041666666666667 | 0 |
| 0.8048611111111111 | 0 |
| 0.8055555555555555 | 0 |
| 0.80625 | 0 |
| 0.8069444444444445 | 0 |
| 0.8076388888888889 | 0 |
| 0.8083333333333332 | 0 |
| 0.8090277777777778 | 0 |
| 0.8097222222222222 | 0 |
| 0.8104166666666667 | 0 |
| 0.811111111111111 | 0 |
| 0.8118055555555556 | 0 |
| 0.8125 | 0 |
| 0.8131944444444444 | 0 |
| 0.813888888888889 | 0 |
| 0.8145833333333333 | 0 |
| 0.8152777777777778 | 0 |
| 0.8159722222222222 | 0 |
| 0.8166666666666668 | 0 |
| 0.8173611111111111 | 0 |
| 0.8180555555555555 | 0 |
| 0.81875 | 0 |
| 0.8194444444444445 | 0 |
| 0.8201388888888889 | 0 |
| 0.8208333333333333 | 0 |
| 0.8215277777777777 | 0 |
| 0.8222222222222223 | 0 |
| 0.8229166666666666 | 0 |
| 0.8236111111111111 | 0 |
| 0.8243055555555556 | 0 |
| 0.8250000000000001 | 0 |
| 0.8256944444444444 | 0 |
| 0.8263888888888888 | 0 |
| 0.8270833333333334 | 0 |
| 0.8277777777777778 | 0 |
| 0.8284722222222222 | 0 |
| 0.8291666666666666 | 0 |
| 0.8298611111111112 | 0 |
| 0.8305555555555556 | 0 |
| 0.8312499999999999 | 0 |
| 0.8319444444444444 | 0 |
| 0.8326388888888889 | 0 |
| 0.8333333333333334 | 0 |
| 0.8340277777777777 | 0 |
| 0.8347222222222223 | 0 |
| 0.8354166666666667 | 0 |
| 0.8361111111111111 | 0 |
| 0.8368055555555555 | 0 |
| 0.8375 | 0 |
| 0.8381944444444445 | 0 |
| 0.8388888888888889 | 0 |
| 0.8395833333333332 | 0 |
| 0.8402777777777778 | 0 |
| 0.8409722222222222 | 0 |
| 0.8416666666666667 | 0 |
| 0.842361111111111 | 0 |
| 0.8430555555555556 | 0 |
| 0.84375 | 0 |
| 0.8444444444444444 | 0 |
| 0.845138888888889 | 0 |
| 0.8458333333333333 | 0 |
| 0.8465277777777778 | 0 |
| 0.8472222222222222 | 0 |
| 0.8479166666666668 | 0 |
| 0.8486111111111111 | 0 |
| 0.8493055555555555 | 0 |
| 0.85 | 0 |
| 0.8506944444444445 | 0 |
| 0.8513888888888889 | 0 |
| 0.8520833333333333 | 0 |
| 0.8527777777777777 | 0 |
| 0.8534722222222223 | 0 |
| 0.8541666666666666 | 0 |
| 0.8548611111111111 | 0 |
| 0.8555555555555556 | 0 |
| 0.8562500000000001 | 0 |
| 0.8569444444444444 | 0 |
| 0.8576388888888888 | 0 |
| 0.8583333333333334 | 0 |
| 0.8590277777777778 | 0 |
| 0.8597222222222222 | 0 |
| 0.8604166666666666 | 0 |
| 0.8611111111111112 | 0 |
| 0.8618055555555556 | 0 |
| 0.8624999999999999 | 0 |
| 0.8631944444444444 | 0 |
| 0.8638888888888889 | 0 |
| 0.8645833333333334 | 0 |
| 0.8652777777777777 | 0 |
| 0.8659722222222223 | 0 |
| 0.8666666666666667 | 0 |
| 0.8673611111111111 | 0 |
| 0.8680555555555555 | 0 |
| 0.86875 | 0 |
| 0.8694444444444445 | 0 |
| 0.8701388888888889 | 0 |
| 0.8708333333333332 | 0 |
| 0.8715277777777778 | 0 |
| 0.8722222222222222 | 0 |
| 0.8729166666666667 | 0 |
| 0.873611111111111 | 0 |
| 0.8743055555555556 | 0 |
| 0.875 | 0 |
| 0.8756944444444444 | 0 |
| 0.876388888888889 | 0 |
| 0.8770833333333333 | 0 |
| 0.8777777777777778 | 0 |
| 0.8784722222222222 | 0 |
| 0.8791666666666668 | 0 |
| 0.8798611111111111 | 0 |
| 0.8805555555555555 | 0 |
| 0.88125 | 0 |
| 0.8819444444444445 | 0 |
| 0.8826388888888889 | 0 |
| 0.8833333333333333 | 0 |
| 0.8840277777777777 | 0 |
| 0.8847222222222223 | 0 |
| 0.8854166666666666 | 0 |
| 0.8861111111111111 | 0 |
| 0.8868055555555556 | 0 |
| 0.8875000000000001 | 0 |
| 0.8881944444444444 | 0 |
| 0.8888888888888888 | 0 |
| 0.8895833333333334 | 0 |
| 0.8902777777777778 | 0 |
| 0.8909722222222222 | 0 |
| 0.8916666666666666 | 0 |
| 0.8923611111111112 | 0 |
| 0.8930555555555556 | 0 |
| 0.8937499999999999 | 0 |
| 0.8944444444444444 | 0 |
| 0.8951388888888889 | 0 |
| 0.8958333333333334 | 0 |
| 0.8965277777777777 | 0 |
| 0.8972222222222223 | 0 |
| 0.8979166666666667 | 0 |
| 0.8986111111111111 | 0 |
| 0.8993055555555555 | 0 |
| 0.9 | 0 |
| 0.9006944444444445 | 0 |
| 0.9013888888888889 | 0 |
| 0.9020833333333332 | 0 |
| 0.9027777777777778 | 0 |
| 0.9034722222222222 | 0 |
| 0.9041666666666667 | 0 |
| 0.904861111111111 | 0 |
| 0.9055555555555556 | 0 |
| 0.90625 | 0 |
| 0.9069444444444444 | 0 |
| 0.907638888888889 | 0 |
| 0.9083333333333333 | 0 |
| 0.9090277777777778 | 0 |
| 0.9097222222222222 | 0 |
| 0.9104166666666668 | 0 |
| 0.9111111111111111 | 0 |
| 0.9118055555555555 | 0 |
| 0.9125 | 0 |
| 0.9131944444444445 | 0 |
| 0.9138888888888889 | 0 |
| 0.9145833333333333 | 0 |
| 0.9152777777777777 | 0 |
| 0.9159722222222223 | 0 |
| 0.9166666666666666 | 0 |
| 0.9173611111111111 | 0 |
| 0.9180555555555556 | 0 |
| 0.9187500000000001 | 0 |
| 0.9194444444444444 | 0 |
| 0.9201388888888888 | 0 |
| 0.9208333333333334 | 0 |
| 0.9215277777777778 | 0 |
| 0.9222222222222222 | 0 |
| 0.9229166666666666 | 0 |
| 0.9236111111111112 | 0 |
| 0.9243055555555556 | 0 |
| 0.9249999999999999 | 0 |
| 0.9256944444444444 | 0 |
| 0.9263888888888889 | 0 |
| 0.9270833333333334 | 0 |
| 0.9277777777777777 | 0 |
| 0.9284722222222223 | 0 |
| 0.9291666666666667 | 0 |
| 0.9298611111111111 | 0 |
| 0.9305555555555555 | 0 |
| 0.93125 | 0 |
| 0.9319444444444445 | 0 |
| 0.9326388888888889 | 0 |
| 0.9333333333333332 | 0 |
| 0.9340277777777778 | 0 |
| 0.9347222222222222 | 0 |
| 0.9354166666666667 | 0 |
| 0.936111111111111 | 0 |
| 0.9368055555555556 | 0 |
| 0.9375 | 0 |
| 0.9381944444444444 | 0 |
| 0.938888888888889 | 0 |
| 0.9395833333333333 | 0 |
| 0.9402777777777778 | 0 |
| 0.9409722222222222 | 0 |
| 0.9416666666666668 | 0 |
| 0.9423611111111111 | 0 |
| 0.9430555555555555 | 0 |
| 0.94375 | 0 |
| 0.9444444444444445 | 0 |
| 0.9451388888888889 | 0 |
| 0.9458333333333333 | 0 |
| 0.9465277777777777 | 0 |
| 0.9472222222222223 | 0 |
| 0.9479166666666666 | 0 |
| 0.9486111111111111 | 0 |
| 0.9493055555555556 | 0 |
| 0.9500000000000001 | 0 |
| 0.9506944444444444 | 0 |
| 0.9513888888888888 | 0 |
| 0.9520833333333334 | 0 |
| 0.9527777777777778 | 0 |
| 0.9534722222222222 | 0 |
| 0.9541666666666666 | 0 |
| 0.9548611111111112 | 0 |
| 0.9555555555555556 | 0 |
| 0.9562499999999999 | 0 |
| 0.9569444444444444 | 0 |
| 0.9576388888888889 | 0 |
| 0.9583333333333334 | 0 |
| 0.9590277777777777 | 0 |
| 0.9597222222222223 | 0 |
| 0.9604166666666667 | 0 |
| 0.9611111111111111 | 0 |
| 0.9618055555555555 | 0 |
| 0.9625 | 0 |
| 0.9631944444444445 | 0 |
| 0.9638888888888889 | 0 |
| 0.9645833333333332 | 0 |
| 0.9652777777777778 | 0 |
| 0.9659722222222222 | 0 |
| 0.9666666666666667 | 0 |
| 0.967361111111111 | 0 |
| 0.9680555555555556 | 0 |
| 0.96875 | 0 |
| 0.9694444444444444 | 0 |
| 0.970138888888889 | 0 |
| 0.9708333333333333 | 0 |
| 0.9715277777777778 | 0 |
| 0.9722222222222222 | 0 |
| 0.9729166666666668 | 0 |
| 0.9736111111111111 | 0 |
| 0.9743055555555555 | 0 |
| 0.975 | 0 |
| 0.9756944444444445 | 0 |
| 0.9763888888888889 | 0 |
| 0.9770833333333333 | 0 |
| 0.9777777777777777 | 0 |
| 0.9784722222222223 | 0 |
| 0.9791666666666666 | 0 |
| 0.9798611111111111 | 0 |
| 0.9805555555555556 | 0 |
| 0.9812500000000001 | 0 |
| 0.9819444444444444 | 0 |
| 0.9826388888888888 | 0 |
| 0.9833333333333334 | 0 |
| 0.9840277777777778 | 0 |
| 0.9847222222222222 | 0 |
| 0.9854166666666666 | 0 |
| 0.9861111111111112 | 0 |
| 0.9868055555555556 | 0 |
| 0.9874999999999999 | 0 |
| 0.9881944444444444 | 0 |
| 0.9888888888888889 | 0 |
| 0.9895833333333334 | 0 |
| 0.9902777777777777 | 0 |
| 0.9909722222222223 | 0 |
| 0.9916666666666667 | 0 |
| 0.9923611111111111 | 0 |
| 0.9930555555555555 | 0 |
| 0.99375 | 0 |
| 0.9944444444444445 | 0 |
| 0.9951388888888889 | 0 |
| 0.9958333333333332 | 0 |
| 0.9965277777777778 | 0 |
| 0.9972222222222222 | 0 |
| 0.9979166666666667 | 0 |
| 0.998611111111111 | 0 |
| 0.9993055555555556 | 0 |